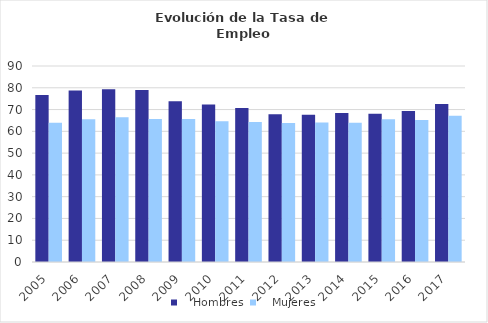
| Category |    Hombres |    Mujeres |
|---|---|---|
| 2005.0 | 76.686 | 63.964 |
| 2006.0 | 78.788 | 65.495 |
| 2007.0 | 79.338 | 66.517 |
| 2008.0 | 78.93 | 65.63 |
| 2009.0 | 73.819 | 65.612 |
| 2010.0 | 72.3 | 64.665 |
| 2011.0 | 70.7 | 64.338 |
| 2012.0 | 67.851 | 63.849 |
| 2013.0 | 67.665 | 64.006 |
| 2014.0 | 68.377 | 63.957 |
| 2015.0 | 68.074 | 65.541 |
| 2016.0 | 69.378 | 65.203 |
| 2017.0 | 72.496 | 67.112 |